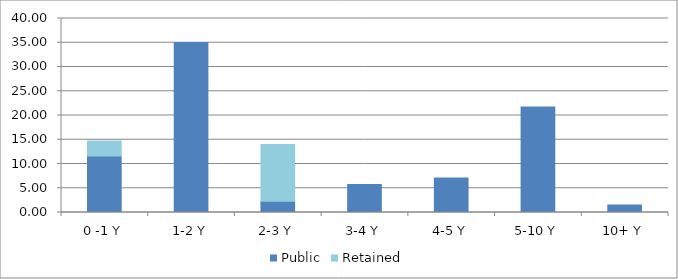
| Category | Public | Retained |
|---|---|---|
| 0 -1 Y | 11.634 | 3.116 |
| 1-2 Y | 35.057 | 0 |
| 2-3 Y | 2.337 | 11.686 |
| 3-4 Y | 5.755 | 0 |
| 4-5 Y | 7.097 | 0 |
| 5-10 Y | 21.761 | 0 |
| 10+ Y | 1.558 | 0 |